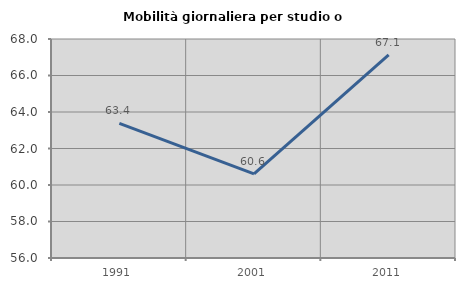
| Category | Mobilità giornaliera per studio o lavoro |
|---|---|
| 1991.0 | 63.38 |
| 2001.0 | 60.606 |
| 2011.0 | 67.13 |